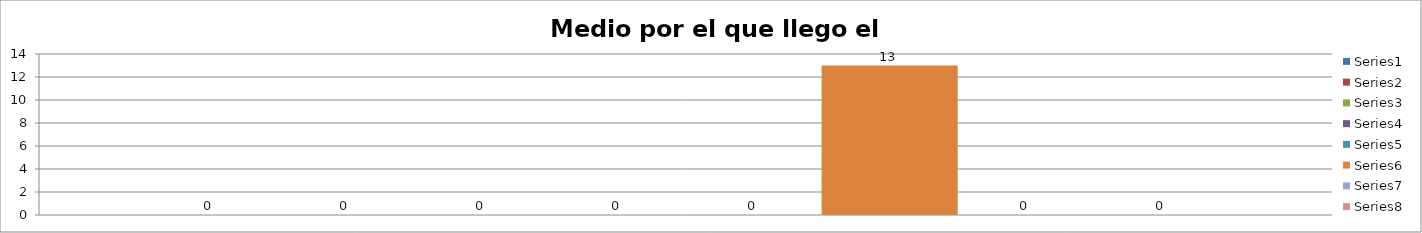
| Category | Series 0 | Series 1 | Series 2 | Series 3 | Series 4 | Series 5 | Series 6 | Series 7 |
|---|---|---|---|---|---|---|---|---|
| 0 | 0 | 0 | 0 | 0 | 0 | 13 | 0 | 0 |